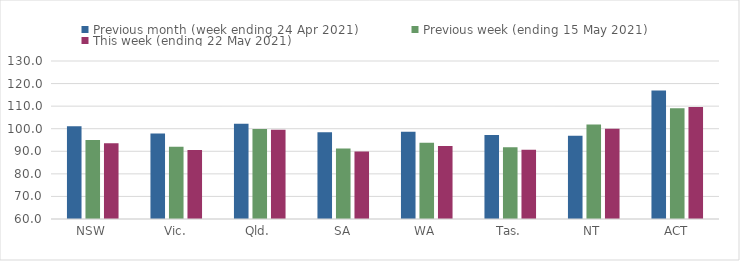
| Category | Previous month (week ending 24 Apr 2021) | Previous week (ending 15 May 2021) | This week (ending 22 May 2021) |
|---|---|---|---|
| NSW | 101.05 | 95.04 | 93.52 |
| Vic. | 97.83 | 91.96 | 90.59 |
| Qld. | 102.19 | 99.9 | 99.49 |
| SA | 98.42 | 91.24 | 89.87 |
| WA | 98.64 | 93.75 | 92.34 |
| Tas. | 97.21 | 91.81 | 90.72 |
| NT | 96.83 | 101.83 | 100.01 |
| ACT | 116.93 | 109.06 | 109.63 |